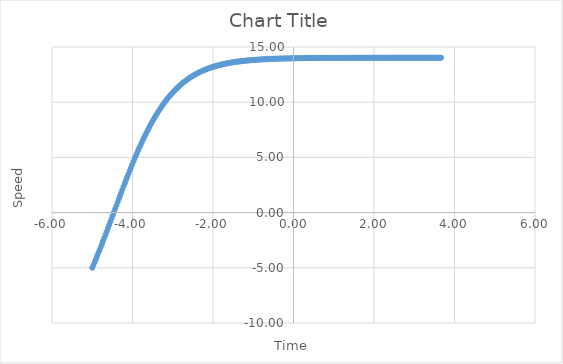
| Category | Series 0 |
|---|---|
| -5.0 | -5 |
| -4.97 | -4.743 |
| -4.9399999999999995 | -4.482 |
| -4.909999999999999 | -4.218 |
| -4.879999999999999 | -3.951 |
| -4.849999999999999 | -3.68 |
| -4.8199999999999985 | -3.406 |
| -4.789999999999998 | -3.129 |
| -4.759999999999998 | -2.849 |
| -4.729999999999998 | -2.567 |
| -4.6999999999999975 | -2.282 |
| -4.669999999999997 | -1.996 |
| -4.639999999999997 | -1.707 |
| -4.609999999999997 | -1.417 |
| -4.5799999999999965 | -1.126 |
| -4.549999999999996 | -0.834 |
| -4.519999999999996 | -0.541 |
| -4.489999999999996 | -0.247 |
| -4.4599999999999955 | 0.048 |
| -4.429999999999995 | 0.342 |
| -4.399999999999995 | 0.636 |
| -4.369999999999995 | 0.93 |
| -4.3399999999999945 | 1.223 |
| -4.309999999999994 | 1.515 |
| -4.279999999999994 | 1.806 |
| -4.249999999999994 | 2.095 |
| -4.2199999999999935 | 2.383 |
| -4.189999999999993 | 2.669 |
| -4.159999999999993 | 2.952 |
| -4.129999999999993 | 3.233 |
| -4.0999999999999925 | 3.512 |
| -4.069999999999992 | 3.788 |
| -4.039999999999992 | 4.061 |
| -4.009999999999992 | 4.33 |
| -3.979999999999992 | 4.597 |
| -3.949999999999992 | 4.859 |
| -3.9199999999999924 | 5.118 |
| -3.8899999999999926 | 5.374 |
| -3.8599999999999928 | 5.625 |
| -3.829999999999993 | 5.872 |
| -3.799999999999993 | 6.114 |
| -3.7699999999999934 | 6.353 |
| -3.7399999999999936 | 6.587 |
| -3.7099999999999937 | 6.816 |
| -3.679999999999994 | 7.041 |
| -3.649999999999994 | 7.261 |
| -3.6199999999999943 | 7.476 |
| -3.5899999999999945 | 7.687 |
| -3.5599999999999947 | 7.893 |
| -3.529999999999995 | 8.094 |
| -3.499999999999995 | 8.29 |
| -3.4699999999999953 | 8.482 |
| -3.4399999999999955 | 8.669 |
| -3.4099999999999957 | 8.851 |
| -3.379999999999996 | 9.028 |
| -3.349999999999996 | 9.2 |
| -3.3199999999999963 | 9.368 |
| -3.2899999999999965 | 9.531 |
| -3.2599999999999967 | 9.689 |
| -3.229999999999997 | 9.843 |
| -3.199999999999997 | 9.993 |
| -3.1699999999999973 | 10.137 |
| -3.1399999999999975 | 10.278 |
| -3.1099999999999977 | 10.414 |
| -3.079999999999998 | 10.546 |
| -3.049999999999998 | 10.674 |
| -3.0199999999999982 | 10.798 |
| -2.9899999999999984 | 10.918 |
| -2.9599999999999986 | 11.034 |
| -2.929999999999999 | 11.146 |
| -2.899999999999999 | 11.255 |
| -2.869999999999999 | 11.36 |
| -2.8399999999999994 | 11.461 |
| -2.8099999999999996 | 11.559 |
| -2.78 | 11.653 |
| -2.75 | 11.744 |
| -2.72 | 11.832 |
| -2.6900000000000004 | 11.917 |
| -2.6600000000000006 | 11.999 |
| -2.630000000000001 | 12.078 |
| -2.600000000000001 | 12.154 |
| -2.570000000000001 | 12.228 |
| -2.5400000000000014 | 12.298 |
| -2.5100000000000016 | 12.366 |
| -2.4800000000000018 | 12.432 |
| -2.450000000000002 | 12.495 |
| -2.420000000000002 | 12.556 |
| -2.3900000000000023 | 12.614 |
| -2.3600000000000025 | 12.671 |
| -2.3300000000000027 | 12.725 |
| -2.300000000000003 | 12.777 |
| -2.270000000000003 | 12.827 |
| -2.2400000000000033 | 12.875 |
| -2.2100000000000035 | 12.922 |
| -2.1800000000000037 | 12.966 |
| -2.150000000000004 | 13.009 |
| -2.120000000000004 | 13.05 |
| -2.0900000000000043 | 13.09 |
| -2.0600000000000045 | 13.128 |
| -2.0300000000000047 | 13.164 |
| -2.000000000000005 | 13.199 |
| -1.9700000000000049 | 13.233 |
| -1.9400000000000048 | 13.265 |
| -1.9100000000000048 | 13.297 |
| -1.8800000000000048 | 13.326 |
| -1.8500000000000048 | 13.355 |
| -1.8200000000000047 | 13.383 |
| -1.7900000000000047 | 13.409 |
| -1.7600000000000047 | 13.434 |
| -1.7300000000000046 | 13.459 |
| -1.7000000000000046 | 13.482 |
| -1.6700000000000046 | 13.505 |
| -1.6400000000000046 | 13.526 |
| -1.6100000000000045 | 13.547 |
| -1.5800000000000045 | 13.567 |
| -1.5500000000000045 | 13.586 |
| -1.5200000000000045 | 13.604 |
| -1.4900000000000044 | 13.621 |
| -1.4600000000000044 | 13.638 |
| -1.4300000000000044 | 13.654 |
| -1.4000000000000044 | 13.67 |
| -1.3700000000000043 | 13.684 |
| -1.3400000000000043 | 13.699 |
| -1.3100000000000043 | 13.712 |
| -1.2800000000000042 | 13.725 |
| -1.2500000000000042 | 13.738 |
| -1.2200000000000042 | 13.75 |
| -1.1900000000000042 | 13.761 |
| -1.1600000000000041 | 13.772 |
| -1.1300000000000041 | 13.783 |
| -1.100000000000004 | 13.793 |
| -1.070000000000004 | 13.803 |
| -1.040000000000004 | 13.812 |
| -1.010000000000004 | 13.821 |
| -0.980000000000004 | 13.83 |
| -0.950000000000004 | 13.838 |
| -0.9200000000000039 | 13.846 |
| -0.8900000000000039 | 13.853 |
| -0.8600000000000039 | 13.861 |
| -0.8300000000000038 | 13.868 |
| -0.8000000000000038 | 13.874 |
| -0.7700000000000038 | 13.881 |
| -0.7400000000000038 | 13.887 |
| -0.7100000000000037 | 13.893 |
| -0.6800000000000037 | 13.898 |
| -0.6500000000000037 | 13.904 |
| -0.6200000000000037 | 13.909 |
| -0.5900000000000036 | 13.914 |
| -0.5600000000000036 | 13.918 |
| -0.5300000000000036 | 13.923 |
| -0.5000000000000036 | 13.927 |
| -0.4700000000000035 | 13.932 |
| -0.4400000000000035 | 13.936 |
| -0.4100000000000035 | 13.939 |
| -0.38000000000000345 | 13.943 |
| -0.3500000000000034 | 13.947 |
| -0.3200000000000034 | 13.95 |
| -0.29000000000000337 | 13.953 |
| -0.26000000000000334 | 13.956 |
| -0.23000000000000334 | 13.959 |
| -0.20000000000000334 | 13.962 |
| -0.17000000000000334 | 13.965 |
| -0.14000000000000334 | 13.967 |
| -0.11000000000000335 | 13.97 |
| -0.08000000000000335 | 13.972 |
| -0.05000000000000335 | 13.975 |
| -0.02000000000000335 | 13.977 |
| 0.00999999999999665 | 13.979 |
| 0.03999999999999665 | 13.981 |
| 0.06999999999999665 | 13.983 |
| 0.09999999999999665 | 13.985 |
| 0.12999999999999665 | 13.986 |
| 0.15999999999999664 | 13.988 |
| 0.18999999999999664 | 13.99 |
| 0.21999999999999664 | 13.991 |
| 0.24999999999999664 | 13.993 |
| 0.27999999999999664 | 13.994 |
| 0.3099999999999966 | 13.996 |
| 0.33999999999999664 | 13.997 |
| 0.36999999999999666 | 13.998 |
| 0.3999999999999967 | 13.999 |
| 0.4299999999999967 | 14.001 |
| 0.45999999999999674 | 14.002 |
| 0.48999999999999677 | 14.003 |
| 0.5199999999999968 | 14.004 |
| 0.5499999999999968 | 14.005 |
| 0.5799999999999969 | 14.006 |
| 0.6099999999999969 | 14.007 |
| 0.6399999999999969 | 14.008 |
| 0.6699999999999969 | 14.008 |
| 0.699999999999997 | 14.009 |
| 0.729999999999997 | 14.01 |
| 0.759999999999997 | 14.011 |
| 0.789999999999997 | 14.011 |
| 0.8199999999999971 | 14.012 |
| 0.8499999999999971 | 14.013 |
| 0.8799999999999971 | 14.013 |
| 0.9099999999999971 | 14.014 |
| 0.9399999999999972 | 14.014 |
| 0.9699999999999972 | 14.015 |
| 0.9999999999999972 | 14.015 |
| 1.0299999999999971 | 14.016 |
| 1.0599999999999972 | 14.016 |
| 1.0899999999999972 | 14.017 |
| 1.1199999999999972 | 14.017 |
| 1.1499999999999972 | 14.018 |
| 1.1799999999999973 | 14.018 |
| 1.2099999999999973 | 14.018 |
| 1.2399999999999973 | 14.019 |
| 1.2699999999999974 | 14.019 |
| 1.2999999999999974 | 14.019 |
| 1.3299999999999974 | 14.02 |
| 1.3599999999999974 | 14.02 |
| 1.3899999999999975 | 14.02 |
| 1.4199999999999975 | 14.021 |
| 1.4499999999999975 | 14.021 |
| 1.4799999999999975 | 14.021 |
| 1.5099999999999976 | 14.021 |
| 1.5399999999999976 | 14.022 |
| 1.5699999999999976 | 14.022 |
| 1.5999999999999976 | 14.022 |
| 1.6299999999999977 | 14.022 |
| 1.6599999999999977 | 14.023 |
| 1.6899999999999977 | 14.023 |
| 1.7199999999999978 | 14.023 |
| 1.7499999999999978 | 14.023 |
| 1.7799999999999978 | 14.023 |
| 1.8099999999999978 | 14.023 |
| 1.8399999999999979 | 14.024 |
| 1.8699999999999979 | 14.024 |
| 1.899999999999998 | 14.024 |
| 1.929999999999998 | 14.024 |
| 1.959999999999998 | 14.024 |
| 1.989999999999998 | 14.024 |
| 2.019999999999998 | 14.024 |
| 2.0499999999999976 | 14.025 |
| 2.0799999999999974 | 14.025 |
| 2.109999999999997 | 14.025 |
| 2.139999999999997 | 14.025 |
| 2.169999999999997 | 14.025 |
| 2.1999999999999966 | 14.025 |
| 2.2299999999999964 | 14.025 |
| 2.2599999999999962 | 14.025 |
| 2.289999999999996 | 14.025 |
| 2.319999999999996 | 14.025 |
| 2.3499999999999956 | 14.025 |
| 2.3799999999999955 | 14.026 |
| 2.4099999999999953 | 14.026 |
| 2.439999999999995 | 14.026 |
| 2.469999999999995 | 14.026 |
| 2.4999999999999947 | 14.026 |
| 2.5299999999999945 | 14.026 |
| 2.5599999999999943 | 14.026 |
| 2.589999999999994 | 14.026 |
| 2.619999999999994 | 14.026 |
| 2.6499999999999937 | 14.026 |
| 2.6799999999999935 | 14.026 |
| 2.7099999999999933 | 14.026 |
| 2.739999999999993 | 14.026 |
| 2.769999999999993 | 14.026 |
| 2.7999999999999927 | 14.026 |
| 2.8299999999999925 | 14.026 |
| 2.8599999999999923 | 14.026 |
| 2.889999999999992 | 14.026 |
| 2.919999999999992 | 14.026 |
| 2.9499999999999917 | 14.026 |
| 2.9799999999999915 | 14.026 |
| 3.0099999999999913 | 14.026 |
| 3.039999999999991 | 14.027 |
| 3.069999999999991 | 14.027 |
| 3.0999999999999908 | 14.027 |
| 3.1299999999999906 | 14.027 |
| 3.1599999999999904 | 14.027 |
| 3.18999999999999 | 14.027 |
| 3.21999999999999 | 14.027 |
| 3.24999999999999 | 14.027 |
| 3.2799999999999896 | 14.027 |
| 3.3099999999999894 | 14.027 |
| 3.339999999999989 | 14.027 |
| 3.369999999999989 | 14.027 |
| 3.399999999999989 | 14.027 |
| 3.4299999999999886 | 14.027 |
| 3.4599999999999884 | 14.027 |
| 3.4899999999999882 | 14.027 |
| 3.519999999999988 | 14.027 |
| 3.549999999999988 | 14.027 |
| 3.5799999999999876 | 14.027 |
| 3.6099999999999874 | 14.027 |
| 3.6399999999999872 | 14.027 |
| 3.669999999999987 | 14.027 |